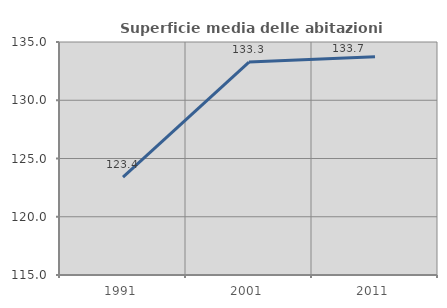
| Category | Superficie media delle abitazioni occupate |
|---|---|
| 1991.0 | 123.4 |
| 2001.0 | 133.273 |
| 2011.0 | 133.744 |